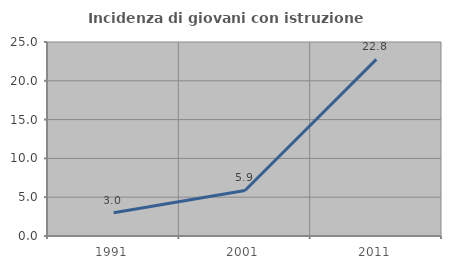
| Category | Incidenza di giovani con istruzione universitaria |
|---|---|
| 1991.0 | 2.994 |
| 2001.0 | 5.865 |
| 2011.0 | 22.754 |